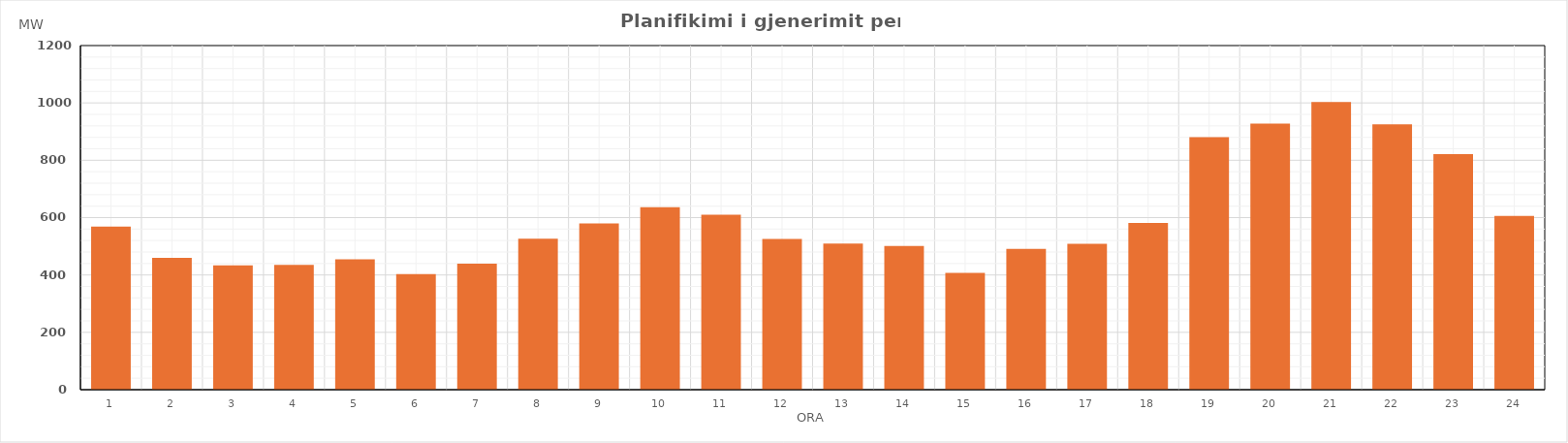
| Category | Max (MW) |
|---|---|
| 0 | 568.56 |
| 1 | 459.42 |
| 2 | 433.47 |
| 3 | 435.46 |
| 4 | 454.48 |
| 5 | 403.33 |
| 6 | 439.85 |
| 7 | 526.69 |
| 8 | 579.94 |
| 9 | 636.32 |
| 10 | 609.86 |
| 11 | 525.55 |
| 12 | 509.31 |
| 13 | 501.4 |
| 14 | 407.22 |
| 15 | 490.7 |
| 16 | 509.14 |
| 17 | 581.39 |
| 18 | 880.52 |
| 19 | 927.5 |
| 20 | 1003.28 |
| 21 | 924.94 |
| 22 | 821.24 |
| 23 | 606.12 |